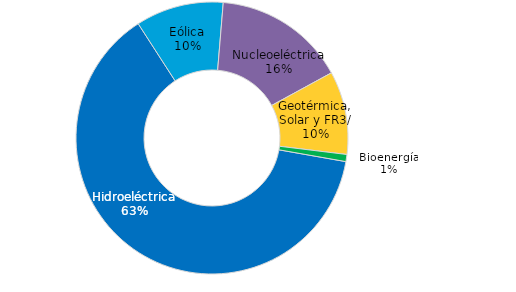
| Category | Series 0 |
|---|---|
| Hidroeléctrica | 38822 |
| Eólica | 6426 |
| Nucleoeléctrica | 9677 |
| Geotérmica, Solar y FR3/ | 6084 |
| Bioenergía | 516 |